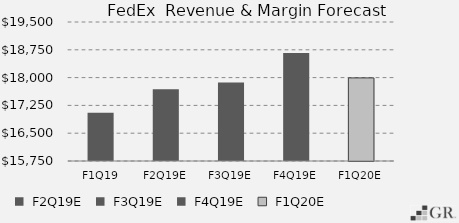
| Category | Total Revenue |
|---|---|
|  F1Q19  | 17052 |
|  F2Q19E  | 17687 |
|  F3Q19E  | 17867.753 |
|  F4Q19E  | 18664.022 |
|  F1Q20E  | 17992.033 |